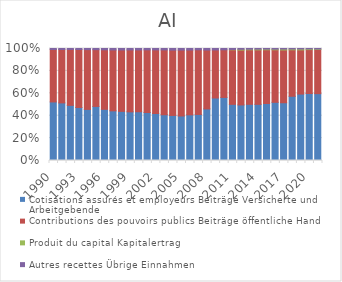
| Category | Cotisations assurés et employeurs | Contributions des pouvoirs publics | Produit du capital | Autres recettes |
|---|---|---|---|---|
| 1990.0 | 0.523 | 0.468 | 0 | 0.009 |
| 1991.0 | 0.514 | 0.477 | 0 | 0.009 |
| 1992.0 | 0.492 | 0.499 | 0 | 0.009 |
| 1993.0 | 0.474 | 0.518 | 0 | 0.009 |
| 1994.0 | 0.456 | 0.533 | 0 | 0.01 |
| 1995.0 | 0.483 | 0.507 | 0 | 0.01 |
| 1996.0 | 0.457 | 0.531 | 0 | 0.012 |
| 1997.0 | 0.443 | 0.544 | 0 | 0.013 |
| 1998.0 | 0.439 | 0.548 | 0 | 0.013 |
| 1999.0 | 0.434 | 0.553 | 0 | 0.013 |
| 2000.0 | 0.435 | 0.552 | 0 | 0.013 |
| 2001.0 | 0.428 | 0.56 | 0 | 0.012 |
| 2002.0 | 0.42 | 0.568 | 0 | 0.013 |
| 2003.0 | 0.409 | 0.579 | 0 | 0.013 |
| 2004.0 | 0.402 | 0.583 | 0 | 0.014 |
| 2005.0 | 0.397 | 0.588 | 0 | 0.014 |
| 2006.0 | 0.408 | 0.579 | 0 | 0.014 |
| 2007.0 | 0.411 | 0.577 | 0 | 0.012 |
| 2008.0 | 0.461 | 0.525 | 0 | 0.014 |
| 2009.0 | 0.558 | 0.429 | 0 | 0.013 |
| 2010.0 | 0.563 | 0.425 | 0 | 0.012 |
| 2011.0 | 0.501 | 0.487 | 0.003 | 0.009 |
| 2012.0 | 0.496 | 0.49 | 0.007 | 0.007 |
| 2013.0 | 0.502 | 0.487 | 0.006 | 0.006 |
| 2014.0 | 0.501 | 0.486 | 0.007 | 0.005 |
| 2015.0 | 0.509 | 0.48 | 0.006 | 0.005 |
| 2016.0 | 0.52 | 0.469 | 0.006 | 0.005 |
| 2017.0 | 0.516 | 0.471 | 0.009 | 0.005 |
| 2018.0 | 0.573 | 0.415 | 0.008 | 0.004 |
| 2019.0 | 0.593 | 0.394 | 0.009 | 0.004 |
| 2020.0 | 0.598 | 0.392 | 0.007 | 0.003 |
| 2021.0 | 0.597 | 0.394 | 0.005 | 0.004 |